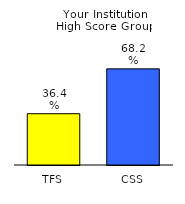
| Category | Series 0 |
|---|---|
| TFS | 0.364 |
| CSS | 0.682 |